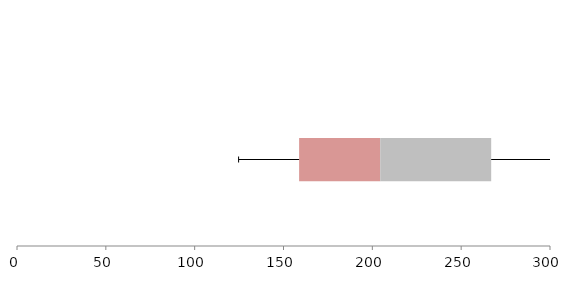
| Category | Series 1 | Series 2 | Series 3 |
|---|---|---|---|
| 0 | 158.788 | 45.649 | 62.454 |